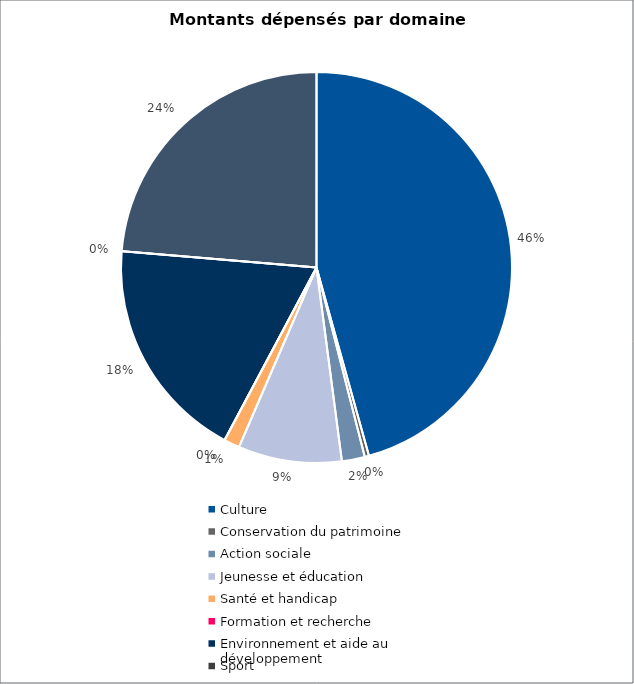
| Category | Series 0 |
|---|---|
| Culture | 2487700 |
| Conservation du patrimoine | 19000 |
| Action sociale | 103400 |
| Jeunesse et éducation | 466400 |
| Santé et handicap | 71000 |
| Formation et recherche | 0 |
| Environnement et aide au
développement | 1009750 |
| Sport | 0 |
| Autres projets d’utilité publique | 1289210 |